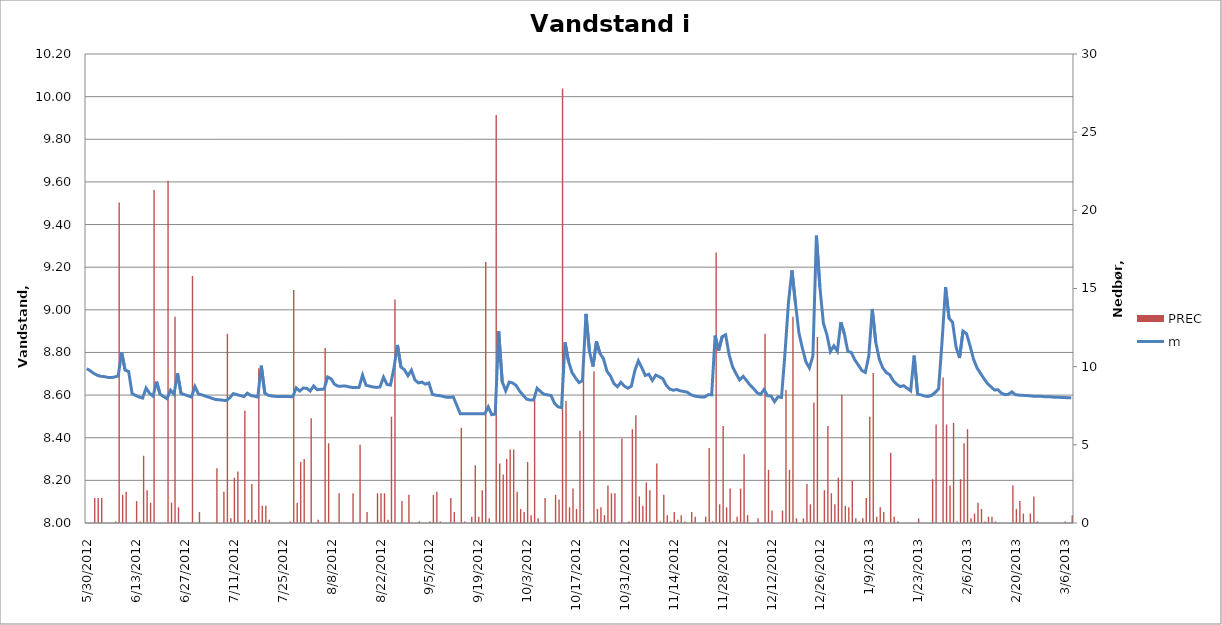
| Category | PREC |
|---|---|
| 5/30/12 | 0 |
| 5/31/12 | 0 |
| 6/1/12 | 1.6 |
| 6/2/12 | 1.6 |
| 6/3/12 | 1.6 |
| 6/4/12 | 0 |
| 6/5/12 | 0 |
| 6/6/12 | 0 |
| 6/7/12 | 0.1 |
| 6/8/12 | 20.5 |
| 6/9/12 | 1.8 |
| 6/10/12 | 2 |
| 6/11/12 | 0 |
| 6/12/12 | 0 |
| 6/13/12 | 1.4 |
| 6/14/12 | 0.1 |
| 6/15/12 | 4.3 |
| 6/16/12 | 2.1 |
| 6/17/12 | 1.3 |
| 6/18/12 | 21.3 |
| 6/19/12 | 0 |
| 6/20/12 | 0 |
| 6/21/12 | 0 |
| 6/22/12 | 21.9 |
| 6/23/12 | 1.3 |
| 6/24/12 | 13.2 |
| 6/25/12 | 1 |
| 6/26/12 | 0 |
| 6/27/12 | 0 |
| 6/28/12 | 0 |
| 6/29/12 | 15.8 |
| 6/30/12 | 0 |
| 7/1/12 | 0.7 |
| 7/2/12 | 0 |
| 7/3/12 | 0 |
| 7/4/12 | 0 |
| 7/5/12 | 0 |
| 7/6/12 | 3.5 |
| 7/7/12 | 0 |
| 7/8/12 | 2 |
| 7/9/12 | 12.1 |
| 7/10/12 | 0.3 |
| 7/11/12 | 2.9 |
| 7/12/12 | 3.3 |
| 7/13/12 | 0 |
| 7/14/12 | 7.2 |
| 7/15/12 | 0.2 |
| 7/16/12 | 2.5 |
| 7/17/12 | 0.2 |
| 7/18/12 | 9.9 |
| 7/19/12 | 1.1 |
| 7/20/12 | 1.1 |
| 7/21/12 | 0.2 |
| 7/22/12 | 0 |
| 7/23/12 | 0 |
| 7/24/12 | 0 |
| 7/25/12 | 0 |
| 7/26/12 | 0 |
| 7/27/12 | 0.1 |
| 7/28/12 | 14.9 |
| 7/29/12 | 1.3 |
| 7/30/12 | 3.9 |
| 7/31/12 | 4.1 |
| 8/1/12 | 0 |
| 8/2/12 | 6.7 |
| 8/3/12 | 0 |
| 8/4/12 | 0.2 |
| 8/5/12 | 0 |
| 8/6/12 | 11.2 |
| 8/7/12 | 5.1 |
| 8/8/12 | 0 |
| 8/9/12 | 0 |
| 8/10/12 | 1.9 |
| 8/11/12 | 0 |
| 8/12/12 | 0 |
| 8/13/12 | 0 |
| 8/14/12 | 1.9 |
| 8/15/12 | 0 |
| 8/16/12 | 5 |
| 8/17/12 | 0 |
| 8/18/12 | 0.7 |
| 8/19/12 | 0 |
| 8/20/12 | 0 |
| 8/21/12 | 1.9 |
| 8/22/12 | 1.9 |
| 8/23/12 | 1.9 |
| 8/24/12 | 0.2 |
| 8/25/12 | 6.8 |
| 8/26/12 | 14.3 |
| 8/27/12 | 0 |
| 8/28/12 | 1.4 |
| 8/29/12 | 0 |
| 8/30/12 | 1.8 |
| 8/31/12 | 0 |
| 9/1/12 | 0 |
| 9/2/12 | 0.1 |
| 9/3/12 | 0 |
| 9/4/12 | 0 |
| 9/5/12 | 0.1 |
| 9/6/12 | 1.8 |
| 9/7/12 | 2 |
| 9/8/12 | 0.1 |
| 9/9/12 | 0 |
| 9/10/12 | 0 |
| 9/11/12 | 1.6 |
| 9/12/12 | 0.7 |
| 9/13/12 | 0 |
| 9/14/12 | 6.1 |
| 9/15/12 | 0.1 |
| 9/16/12 | 0 |
| 9/17/12 | 0.4 |
| 9/18/12 | 3.7 |
| 9/19/12 | 0.4 |
| 9/20/12 | 2.1 |
| 9/21/12 | 16.7 |
| 9/22/12 | 0.3 |
| 9/23/12 | 0 |
| 9/24/12 | 26.1 |
| 9/25/12 | 3.8 |
| 9/26/12 | 3.1 |
| 9/27/12 | 4.1 |
| 9/28/12 | 4.7 |
| 9/29/12 | 4.7 |
| 9/30/12 | 2 |
| 10/1/12 | 0.9 |
| 10/2/12 | 0.7 |
| 10/3/12 | 3.9 |
| 10/4/12 | 0.5 |
| 10/5/12 | 7.9 |
| 10/6/12 | 0.3 |
| 10/7/12 | 0 |
| 10/8/12 | 1.6 |
| 10/9/12 | 0 |
| 10/10/12 | 0 |
| 10/11/12 | 1.8 |
| 10/12/12 | 1.5 |
| 10/13/12 | 27.8 |
| 10/14/12 | 7.8 |
| 10/15/12 | 1 |
| 10/16/12 | 2.2 |
| 10/17/12 | 0.9 |
| 10/18/12 | 5.9 |
| 10/19/12 | 9.7 |
| 10/20/12 | 0 |
| 10/21/12 | 0.1 |
| 10/22/12 | 9.7 |
| 10/23/12 | 0.9 |
| 10/24/12 | 1 |
| 10/25/12 | 0.5 |
| 10/26/12 | 2.4 |
| 10/27/12 | 1.9 |
| 10/28/12 | 1.9 |
| 10/29/12 | 0 |
| 10/30/12 | 5.4 |
| 10/31/12 | 0 |
| 11/1/12 | 0.1 |
| 11/2/12 | 6 |
| 11/3/12 | 6.9 |
| 11/4/12 | 1.7 |
| 11/5/12 | 1.1 |
| 11/6/12 | 2.6 |
| 11/7/12 | 2.1 |
| 11/8/12 | 0 |
| 11/9/12 | 3.8 |
| 11/10/12 | 0.1 |
| 11/11/12 | 1.8 |
| 11/12/12 | 0.5 |
| 11/13/12 | 0.1 |
| 11/14/12 | 0.7 |
| 11/15/12 | 0.2 |
| 11/16/12 | 0.5 |
| 11/17/12 | 0.1 |
| 11/18/12 | 0 |
| 11/19/12 | 0.7 |
| 11/20/12 | 0.4 |
| 11/21/12 | 0 |
| 11/22/12 | 0 |
| 11/23/12 | 0.4 |
| 11/24/12 | 4.8 |
| 11/25/12 | 0.1 |
| 11/26/12 | 17.3 |
| 11/27/12 | 1.2 |
| 11/28/12 | 6.2 |
| 11/29/12 | 1 |
| 11/30/12 | 2.2 |
| 12/1/12 | 0.1 |
| 12/2/12 | 0.4 |
| 12/3/12 | 2.2 |
| 12/4/12 | 4.4 |
| 12/5/12 | 0.5 |
| 12/6/12 | 0 |
| 12/7/12 | 0 |
| 12/8/12 | 0.3 |
| 12/9/12 | 0 |
| 12/10/12 | 12.1 |
| 12/11/12 | 3.4 |
| 12/12/12 | 0.8 |
| 12/13/12 | 0 |
| 12/14/12 | 0 |
| 12/15/12 | 0.8 |
| 12/16/12 | 8.5 |
| 12/17/12 | 3.4 |
| 12/18/12 | 13.2 |
| 12/19/12 | 0.3 |
| 12/20/12 | 0 |
| 12/21/12 | 0.3 |
| 12/22/12 | 2.5 |
| 12/23/12 | 1.2 |
| 12/24/12 | 7.7 |
| 12/25/12 | 11.9 |
| 12/26/12 | 0 |
| 12/27/12 | 2.1 |
| 12/28/12 | 6.2 |
| 12/29/12 | 1.9 |
| 12/30/12 | 1.2 |
| 12/31/12 | 2.9 |
| 1/1/13 | 8.2 |
| 1/2/13 | 1.1 |
| 1/3/13 | 1 |
| 1/4/13 | 2.7 |
| 1/5/13 | 0.3 |
| 1/6/13 | 0.1 |
| 1/7/13 | 0.3 |
| 1/8/13 | 1.6 |
| 1/9/13 | 6.8 |
| 1/10/13 | 9.6 |
| 1/11/13 | 0.4 |
| 1/12/13 | 1 |
| 1/13/13 | 0.7 |
| 1/14/13 | 0 |
| 1/15/13 | 4.5 |
| 1/16/13 | 0.4 |
| 1/17/13 | 0.1 |
| 1/18/13 | 0 |
| 1/19/13 | 0 |
| 1/20/13 | 0 |
| 1/21/13 | 0 |
| 1/22/13 | 0 |
| 1/23/13 | 0.3 |
| 1/24/13 | 0 |
| 1/25/13 | 0 |
| 1/26/13 | 0 |
| 1/27/13 | 2.8 |
| 1/28/13 | 6.3 |
| 1/29/13 | 0 |
| 1/30/13 | 9.3 |
| 1/31/13 | 6.3 |
| 2/1/13 | 2.4 |
| 2/2/13 | 6.4 |
| 2/3/13 | 0.1 |
| 2/4/13 | 2.8 |
| 2/5/13 | 5.1 |
| 2/6/13 | 6 |
| 2/7/13 | 0.3 |
| 2/8/13 | 0.6 |
| 2/9/13 | 1.3 |
| 2/10/13 | 0.9 |
| 2/11/13 | 0.1 |
| 2/12/13 | 0.4 |
| 2/13/13 | 0.4 |
| 2/14/13 | 0.1 |
| 2/15/13 | 0 |
| 2/16/13 | 0 |
| 2/17/13 | 0 |
| 2/18/13 | 0 |
| 2/19/13 | 2.4 |
| 2/20/13 | 0.9 |
| 2/21/13 | 1.4 |
| 2/22/13 | 0.6 |
| 2/23/13 | 0 |
| 2/24/13 | 0.6 |
| 2/25/13 | 1.7 |
| 2/26/13 | 0.1 |
| 2/27/13 | 0 |
| 2/28/13 | 0 |
| 3/1/13 | 0 |
| 3/2/13 | 0 |
| 3/3/13 | 0 |
| 3/4/13 | 0 |
| 3/5/13 | 0 |
| 3/6/13 | 0.1 |
| 3/7/13 | 0 |
| 3/8/13 | 0.5 |